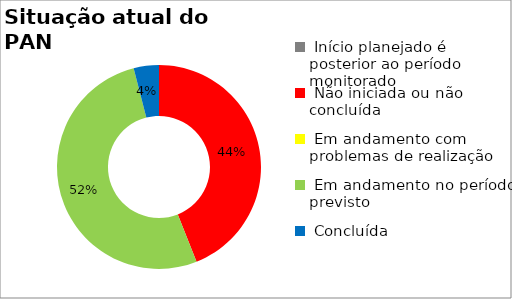
| Category | Series 0 |
|---|---|
|  Início planejado é posterior ao período monitorado | 0 |
|  Não iniciada ou não concluída | 0.44 |
|  Em andamento com problemas de realização | 0 |
|  Em andamento no período previsto  | 0.52 |
|  Concluída | 0.04 |